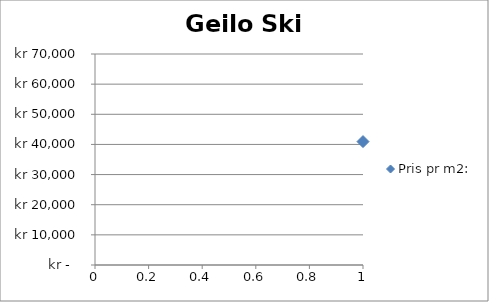
| Category | Pris pr m2: |
|---|---|
| 0 | 40945 |
| 1 | 38211 |
| 2 | 44181 |
| 3 | 25852 |
| 4 | 40164 |
| 5 | 38667 |
| 6 | 36466 |
| 7 | 37255 |
| 8 | 32394 |
| 9 | 32576 |
| 10 | 36585 |
| 11 | 38618 |
| 12 | 25000 |
| 13 | 47159 |
| 14 | 38667 |
| 15 | 37298 |
| 16 | 33026 |
| 17 | 53982 |
| 18 | 31395 |
| 19 | 46635 |
| 20 | 35252 |
| 21 | 31395 |
| 22 | 29299 |
| 23 | 31818 |
| 24 | 36090 |
| 25 | 35857 |
| 26 | 33333 |
| 27 | 36224 |
| 28 | 42529 |
| 29 | 38889 |
| 30 | 47361 |
| 31 | 46951 |
| 32 | 38365 |
| 33 | 28882 |
| 34 | 30658 |
| 35 | 37681 |
| 36 | 43333 |
| 37 | 37681 |
| 38 | 40441 |
| 39 | 45192 |
| 40 | 39692 |
| 41 | 37681 |
| 42 | 39167 |
| 43 | 38365 |
| 44 | 35536 |
| 45 | 27632 |
| 46 | 48561 |
| 47 | 47794 |
| 48 | 56587 |
| 49 | 39474 |
| 50 | 42012 |
| 51 | 36232 |
| 52 | 47183 |
| 53 | 33767 |
| 54 | 51351 |
| 55 | 34916 |
| 56 | 34167 |
| 57 | 31633 |
| 58 | 37963 |
| 59 | 39894 |
| 60 | 28947 |
| 61 | 43125 |
| 62 | 30000 |
| 63 | 33696 |
| 64 | 35507 |
| 65 | 39474 |
| 66 | 50495 |
| 67 | 33333 |
| 68 | 29032 |
| 69 | 38462 |
| 70 | 39035 |
| 71 | 41667 |
| 72 | 20721 |
| 73 | 48113 |
| 74 | 46753 |
| 75 | 45156 |
| 76 | 41404 |
| 77 | 53689 |
| 78 | 45577 |
| 79 | 40650 |
| 80 | 37500 |
| 81 | 43056 |
| 82 | 46959 |
| 83 | 25342 |
| 84 | 38372 |
| 85 | 31690 |
| 86 | 40123 |
| 87 | 40984 |
| 88 | 23137 |
| 89 | 54545 |
| 90 | 46316 |
| 91 | 27426 |
| 92 | 39098 |
| 93 | 51351 |
| 94 | 32759 |
| 95 | 40915 |
| 96 | 50955 |
| 97 | 47273 |
| 98 | 25352 |
| 99 | 41406 |
| 100 | 33163 |
| 101 | 41406 |
| 102 | 52304 |
| 103 | 40984 |
| 104 | 32639 |
| 105 | 55932 |
| 106 | 47500 |
| 107 | 40141 |
| 108 | 16480 |
| 109 | 39831 |
| 110 | 17073 |
| 111 | 37705 |
| 112 | 40476 |
| 113 | 41803 |
| 114 | 33163 |
| 115 | 46226 |
| 116 | 44444 |
| 117 | 38346 |
| 118 | 31528 |
| 119 | 36090 |
| 120 | 30469 |
| 121 | 43873 |
| 122 | 44161 |
| 123 | 36518 |
| 124 | 33333 |
| 125 | 56780 |
| 126 | 41892 |
| 127 | 27011 |
| 128 | 22549 |
| 129 | 56738 |
| 130 | 36522 |
| 131 | 51429 |
| 132 | 50833 |
| 133 | 33864 |
| 134 | 57500 |
| 135 | 36752 |
| 136 | 45000 |
| 137 | 30000 |
| 138 | 34259 |
| 139 | 30833 |
| 140 | 36976 |
| 141 | 38010 |
| 142 | 48201 |
| 143 | 33571 |
| 144 | 17613 |
| 145 | 47170 |
| 146 | 32941 |
| 147 | 18705 |
| 148 | 33448 |
| 149 | 40705 |
| 150 | 31064 |
| 151 | 44141 |
| 152 | 17323 |
| 153 | 36082 |
| 154 | 41429 |
| 155 | 24375 |
| 156 | 38333 |
| 157 | 23137 |
| 158 | 57965 |
| 159 | 41429 |
| 160 | 25000 |
| 161 | 46438 |
| 162 | 43636 |
| 163 | 34615 |
| 164 | 36667 |
| 165 | 53279 |
| 166 | 47945 |
| 167 | 52941 |
| 168 | 41935 |
| 169 | 43636 |
| 170 | 28000 |
| 171 | 25926 |
| 172 | 31000 |
| 173 | 34615 |
| 174 | 34184 |
| 175 | 31921 |
| 176 | 41379 |
| 177 | 51948 |
| 178 | 41772 |
| 179 | 43182 |
| 180 | 39091 |
| 181 | 19471 |
| 182 | 31600 |
| 183 | 23295 |
| 184 | 41096 |
| 185 | 51852 |
| 186 | 34959 |
| 187 | 55814 |
| 188 | 31614 |
| 189 | 47799 |
| 190 | 42453 |
| 191 | 36774 |
| 192 | 39773 |
| 193 | 52397 |
| 194 | 38372 |
| 195 | 37059 |
| 196 | 33654 |
| 197 | 40580 |
| 198 | 29767 |
| 199 | 22344 |
| 200 | 37821 |
| 201 | 59459 |
| 202 | 32326 |
| 203 | 46491 |
| 204 | 35227 |
| 205 | 34655 |
| 206 | 40580 |
| 207 | 30556 |
| 208 | 41146 |
| 209 | 25610 |
| 210 | 37368 |
| 211 | 35294 |
| 212 | 40909 |
| 213 | 36029 |
| 214 | 31250 |
| 215 | 40506 |
| 216 | 23333 |
| 217 | 43750 |
| 218 | 29268 |
| 219 | 40143 |
| 220 | 26563 |
| 221 | 45638 |
| 222 | 23894 |
| 223 | 30000 |
| 224 | 49357 |
| 225 | 32520 |
| 226 | 35556 |
| 227 | 46721 |
| 228 | 40976 |
| 229 | 31551 |
| 230 | 25967 |
| 231 | 21250 |
| 232 | 32110 |
| 233 | 32955 |
| 234 | 34066 |
| 235 | 43750 |
| 236 | 37789 |
| 237 | 43269 |
| 238 | 41870 |
| 239 | 36737 |
| 240 | 54237 |
| 241 | 43976 |
| 242 | 48529 |
| 243 | 41509 |
| 244 | 43496 |
| 245 | 28333 |
| 246 | 38689 |
| 247 | 31395 |
| 248 | 49180 |
| 249 | 47619 |
| 250 | 41667 |
| 251 | 48361 |
| 252 | 34615 |
| 253 | 32308 |